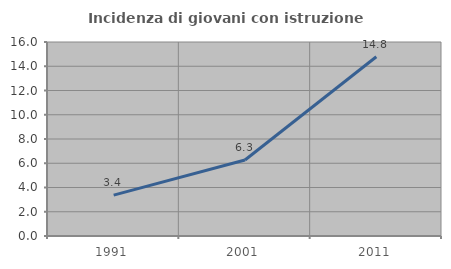
| Category | Incidenza di giovani con istruzione universitaria |
|---|---|
| 1991.0 | 3.367 |
| 2001.0 | 6.268 |
| 2011.0 | 14.787 |